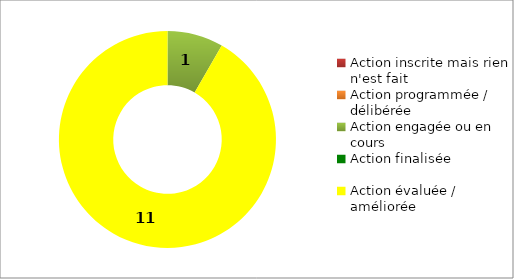
| Category | Series 0 |
|---|---|
| Action inscrite mais rien n'est fait | 0 |
| Action programmée / délibérée | 0 |
| Action engagée ou en cours | 1 |
| Action finalisée | 0 |
| Action évaluée / améliorée | 11 |